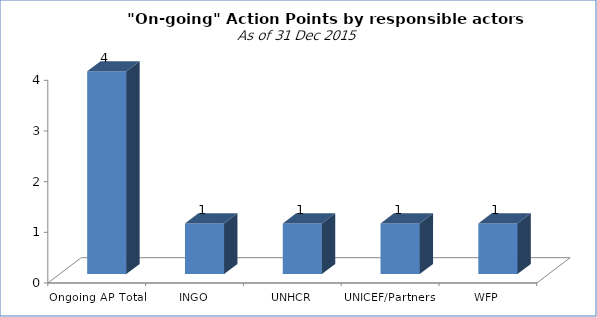
| Category | Count of Action |
|---|---|
| Ongoing AP Total | 4 |
| INGO | 1 |
| UNHCR | 1 |
| UNICEF/Partners | 1 |
| WFP | 1 |